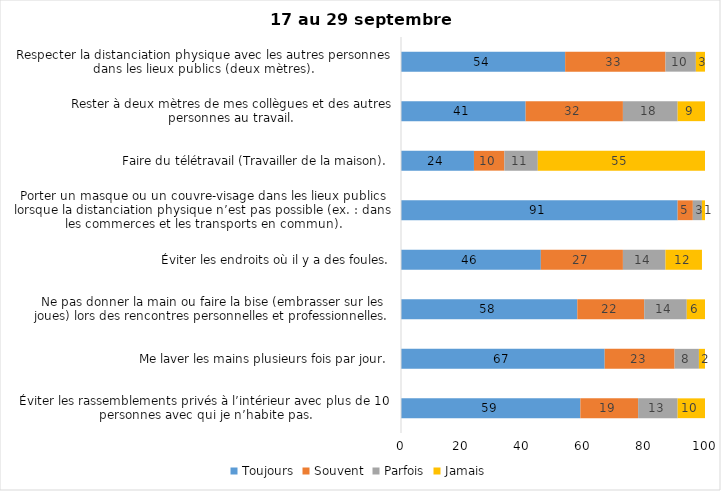
| Category | Toujours | Souvent | Parfois | Jamais |
|---|---|---|---|---|
| Éviter les rassemblements privés à l’intérieur avec plus de 10 personnes avec qui je n’habite pas. | 59 | 19 | 13 | 10 |
| Me laver les mains plusieurs fois par jour. | 67 | 23 | 8 | 2 |
| Ne pas donner la main ou faire la bise (embrasser sur les joues) lors des rencontres personnelles et professionnelles. | 58 | 22 | 14 | 6 |
| Éviter les endroits où il y a des foules. | 46 | 27 | 14 | 12 |
| Porter un masque ou un couvre-visage dans les lieux publics lorsque la distanciation physique n’est pas possible (ex. : dans les commerces et les transports en commun). | 91 | 5 | 3 | 1 |
| Faire du télétravail (Travailler de la maison). | 24 | 10 | 11 | 55 |
| Rester à deux mètres de mes collègues et des autres personnes au travail. | 41 | 32 | 18 | 9 |
| Respecter la distanciation physique avec les autres personnes dans les lieux publics (deux mètres). | 54 | 33 | 10 | 3 |